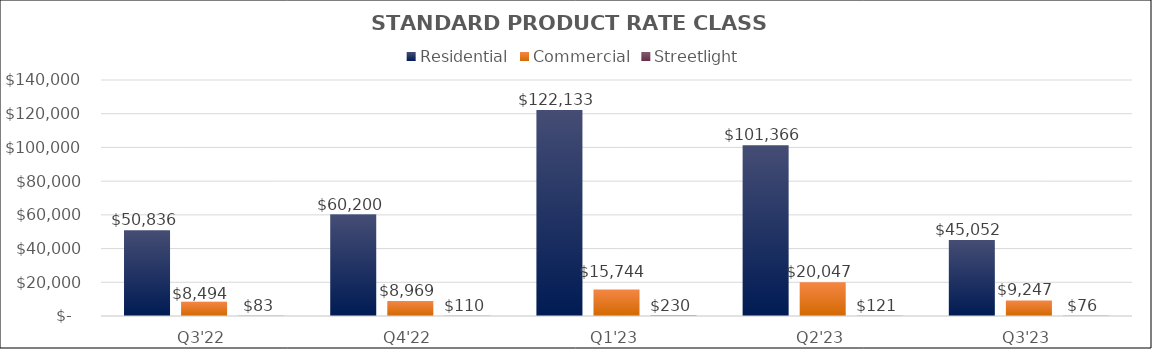
| Category | Residential | Commercial | Streetlight |
|---|---|---|---|
| Q3'22 | 50835.505 | 8494.17 | 83.495 |
| Q4'22 | 60199.765 | 8969.257 | 109.711 |
| Q1'23 | 122133.298 | 15743.945 | 229.88 |
| Q2'23 | 101365.531 | 20047.374 | 120.991 |
| Q3'23 | 45051.996 | 9246.881 | 75.628 |